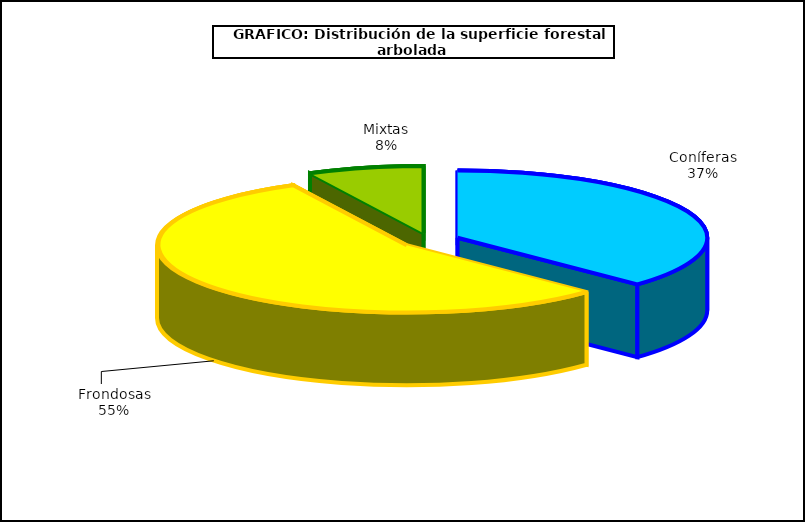
| Category | Series 0 |
|---|---|
| Coníferas | 6793393.172 |
| Frondosas | 10095754.08 |
| Mixtas | 1371496.66 |